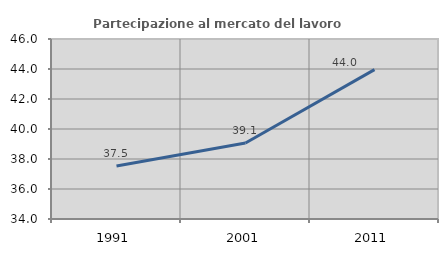
| Category | Partecipazione al mercato del lavoro  femminile |
|---|---|
| 1991.0 | 37.533 |
| 2001.0 | 39.067 |
| 2011.0 | 43.956 |